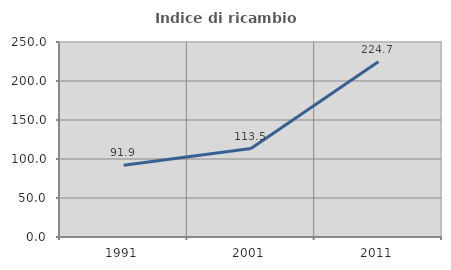
| Category | Indice di ricambio occupazionale  |
|---|---|
| 1991.0 | 91.927 |
| 2001.0 | 113.462 |
| 2011.0 | 224.722 |